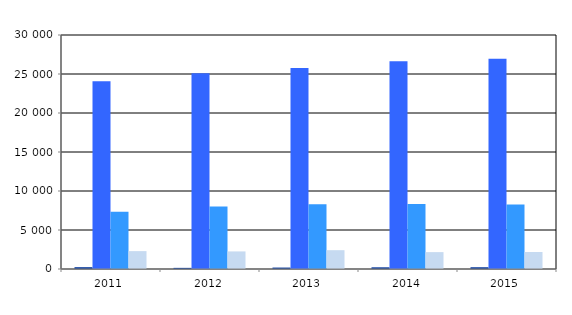
| Category | Series 0 | Series 1 | Series 2 | Series 3 |
|---|---|---|---|---|
| 2011.0 | 230 | 24077 | 7353 | 2292 |
| 2012.0 | 145 | 25087 | 8011 | 2254 |
| 2013.0 | 182 | 25772 | 8298 | 2412 |
| 2014.0 | 214 | 26643 | 8323 | 2163 |
| 2015.0 | 223 | 26966 | 8259 | 2181 |